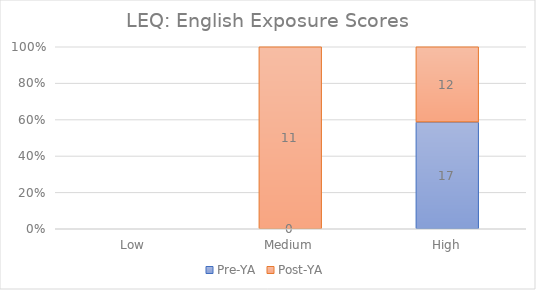
| Category | Pre-YA | Post-YA |
|---|---|---|
| Low | 0 | 0 |
| Medium | 0 | 11 |
| High | 17 | 12 |